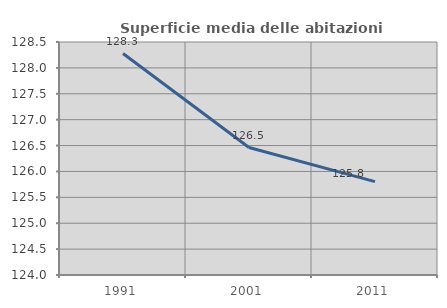
| Category | Superficie media delle abitazioni occupate |
|---|---|
| 1991.0 | 128.277 |
| 2001.0 | 126.462 |
| 2011.0 | 125.804 |